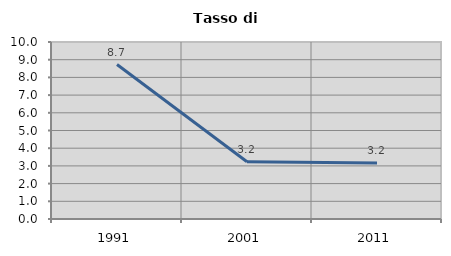
| Category | Tasso di disoccupazione   |
|---|---|
| 1991.0 | 8.725 |
| 2001.0 | 3.233 |
| 2011.0 | 3.165 |